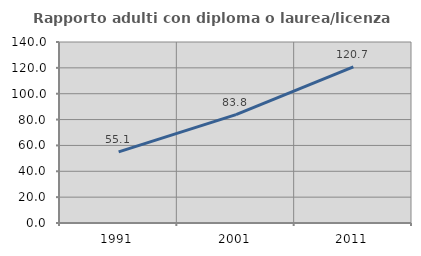
| Category | Rapporto adulti con diploma o laurea/licenza media  |
|---|---|
| 1991.0 | 55.06 |
| 2001.0 | 83.774 |
| 2011.0 | 120.693 |